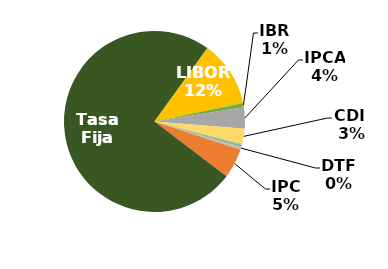
| Category | Series 0 |
|---|---|
| DTF | 0.006 |
| IPC | 0.053 |
| Tasa Fija | 0.746 |
| LIBOR | 0.118 |
| IBR | 0.008 |
| IPCA | 0.038 |
| CDI  | 0.027 |
| TJLP  | 0.003 |
| TAB | 0.001 |